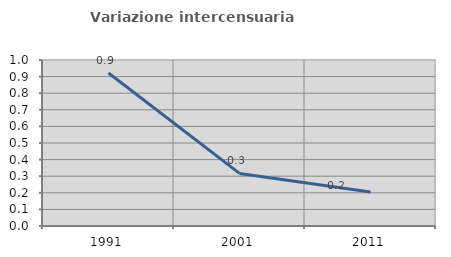
| Category | Variazione intercensuaria annua |
|---|---|
| 1991.0 | 0.922 |
| 2001.0 | 0.317 |
| 2011.0 | 0.205 |